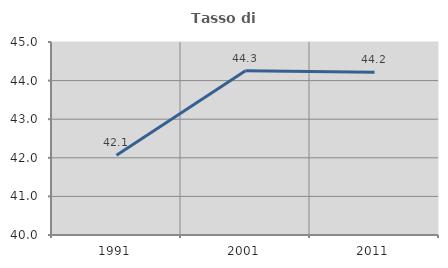
| Category | Tasso di occupazione   |
|---|---|
| 1991.0 | 42.063 |
| 2001.0 | 44.255 |
| 2011.0 | 44.215 |